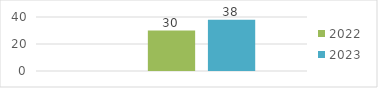
| Category | Enero - Marzo | 2022 | 2023 |
|---|---|---|---|
| 0 |  | 30 | 38 |